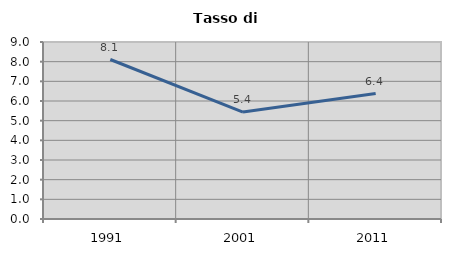
| Category | Tasso di disoccupazione   |
|---|---|
| 1991.0 | 8.11 |
| 2001.0 | 5.438 |
| 2011.0 | 6.377 |